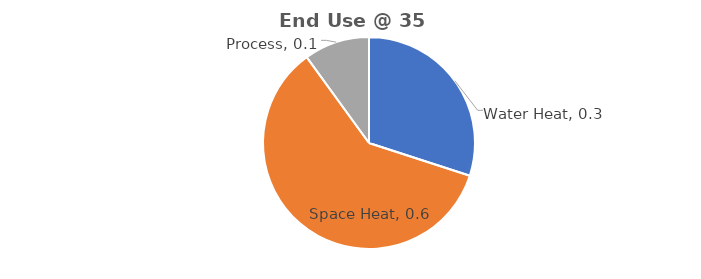
| Category | Series 0 |
|---|---|
| Water Heat | 0.3 |
| Space Heat | 0.6 |
| Process | 0.1 |